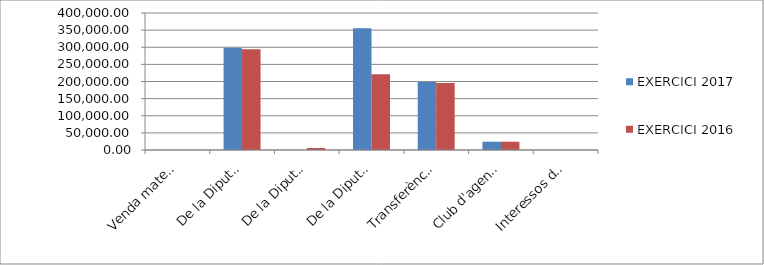
| Category | EXERCICI 2017 | EXERCICI 2016 |
|---|---|---|
| Venda material de difusió i guies | 300 | 300 |
| De la Diputació de Girona | 298315.3 | 293924.3 |
| De la Diputació de Girona per paga extra exercici 2012 | 0 | 5876.22 |
| De la Diputació de Girona, aportació extraordinària | 355684.7 | 221199.48 |
| Transferències corrents Ajuntaments | 198876.87 | 195949.53 |
| Club d'agents econòmics i senyalització | 24200 | 24200 |
| Interessos de dipòsits | 80 | 80 |